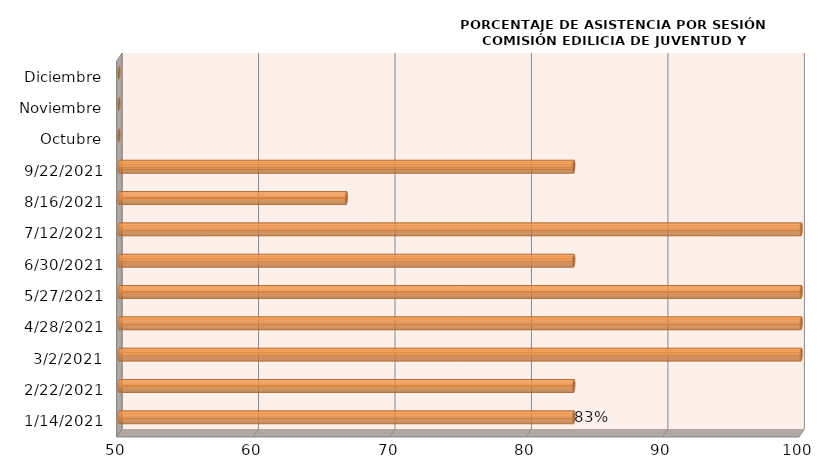
| Category | Series 0 |
|---|---|
| 14/01/2021 | 83.333 |
| 22/02/2021 | 83.333 |
| 02/03/2021 | 100 |
| 28/04/2021 | 100 |
| 27/05/2021 | 100 |
| 30/06/2021 | 83.333 |
| 12/07/2021 | 100 |
| 16/08/2021 | 66.667 |
| 22/09/2021 | 83.333 |
| Octubre | 0 |
| Noviembre | 0 |
| Diciembre | 0 |